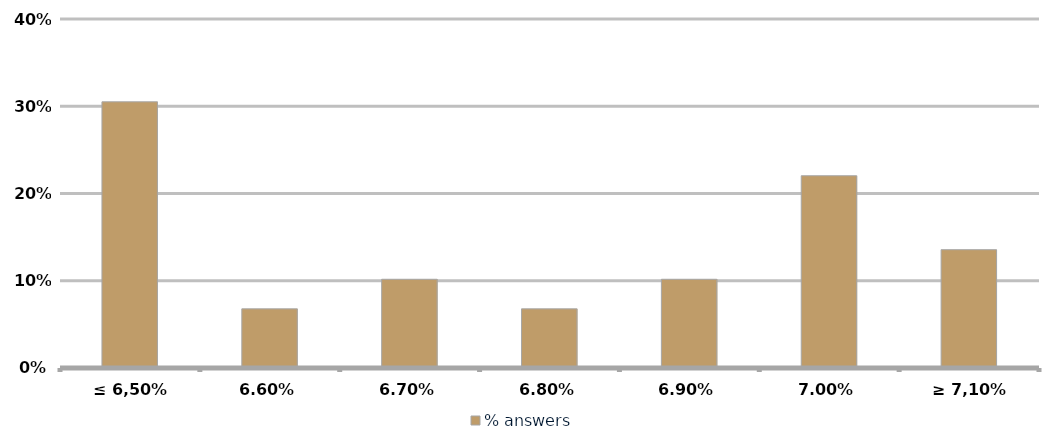
| Category | % answers |
|---|---|
| ≤ 6,50% | 0.305 |
| 6.60% | 0.068 |
| 6.70% | 0.102 |
| 6.80% | 0.068 |
| 6.90% | 0.102 |
| 7.00% | 0.22 |
| ≥ 7,10% | 0.136 |